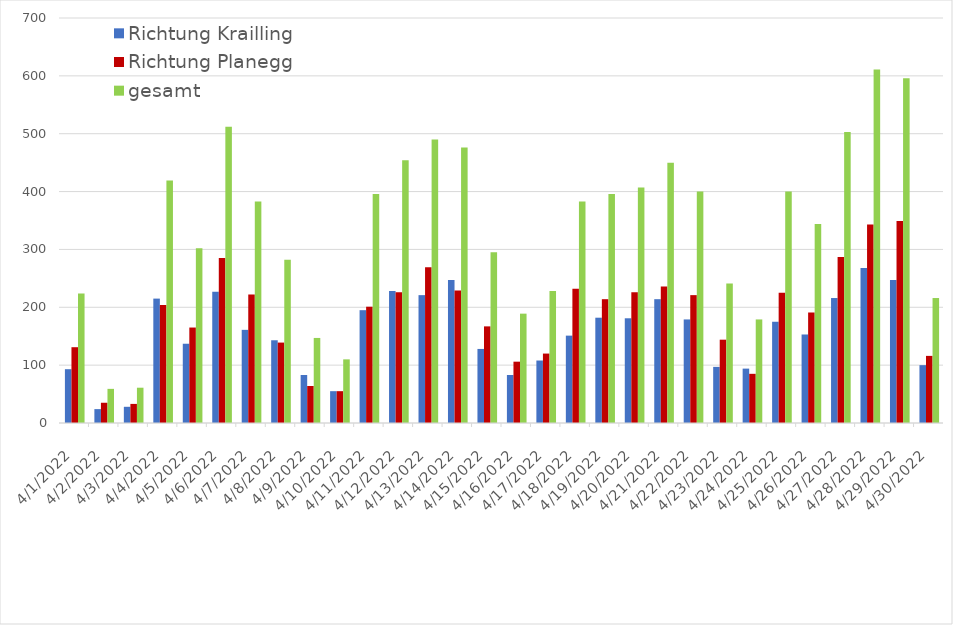
| Category | Richtung Krailling | Richtung Planegg | gesamt |
|---|---|---|---|
| 4/1/22 | 93 | 131 | 224 |
| 4/2/22 | 24 | 35 | 59 |
| 4/3/22 | 28 | 33 | 61 |
| 4/4/22 | 215 | 204 | 419 |
| 4/5/22 | 137 | 165 | 302 |
| 4/6/22 | 227 | 285 | 512 |
| 4/7/22 | 161 | 222 | 383 |
| 4/8/22 | 143 | 139 | 282 |
| 4/9/22 | 83 | 64 | 147 |
| 4/10/22 | 55 | 55 | 110 |
| 4/11/22 | 195 | 201 | 396 |
| 4/12/22 | 228 | 226 | 454 |
| 4/13/22 | 221 | 269 | 490 |
| 4/14/22 | 247 | 229 | 476 |
| 4/15/22 | 128 | 167 | 295 |
| 4/16/22 | 83 | 106 | 189 |
| 4/17/22 | 108 | 120 | 228 |
| 4/18/22 | 151 | 232 | 383 |
| 4/19/22 | 182 | 214 | 396 |
| 4/20/22 | 181 | 226 | 407 |
| 4/21/22 | 214 | 236 | 450 |
| 4/22/22 | 179 | 221 | 400 |
| 4/23/22 | 97 | 144 | 241 |
| 4/24/22 | 94 | 85 | 179 |
| 4/25/22 | 175 | 225 | 400 |
| 4/26/22 | 153 | 191 | 344 |
| 4/27/22 | 216 | 287 | 503 |
| 4/28/22 | 268 | 343 | 611 |
| 4/29/22 | 247 | 349 | 596 |
| 4/30/22 | 100 | 116 | 216 |